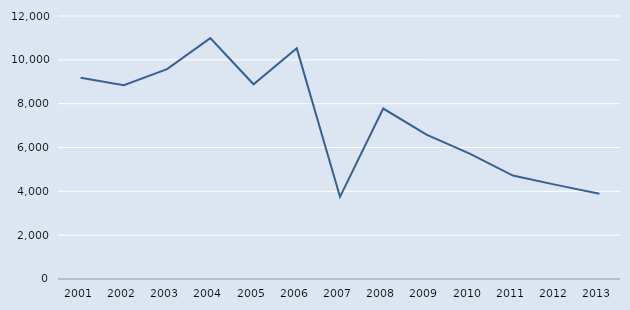
| Category | Series 0 |
|---|---|
| 2001.0 | 9182 |
| 2002.0 | 8844 |
| 2003.0 | 9577 |
| 2004.0 | 10988 |
| 2005.0 | 8884 |
| 2006.0 | 10524 |
| 2007.0 | 3749 |
| 2008.0 | 7778 |
| 2009.0 | 6583 |
| 2010.0 | 5723 |
| 2011.0 | 4720 |
| 2012.0 | 4294 |
| 2013.0 | 3887 |